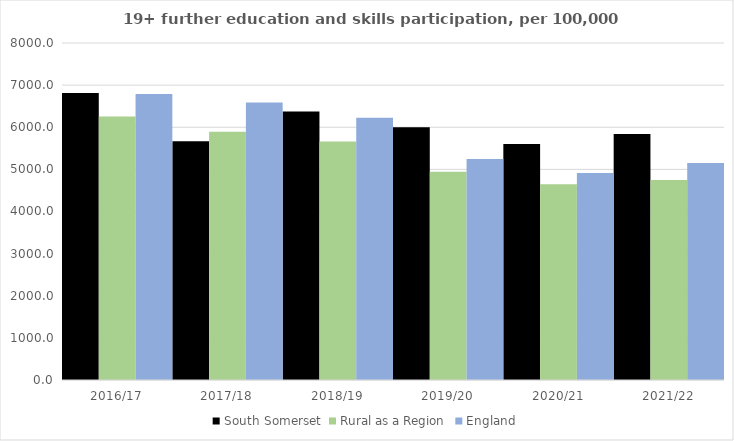
| Category | South Somerset | Rural as a Region | England |
|---|---|---|---|
| 2016/17 | 6814 | 6253.401 | 6788 |
| 2017/18 | 5667 | 5892.029 | 6588 |
| 2018/19 | 6372 | 5661.873 | 6227 |
| 2019/20 | 5999 | 4943.801 | 5244 |
| 2020/21 | 5602 | 4646.727 | 4913 |
| 2021/22 | 5838 | 4747.049 | 5151 |